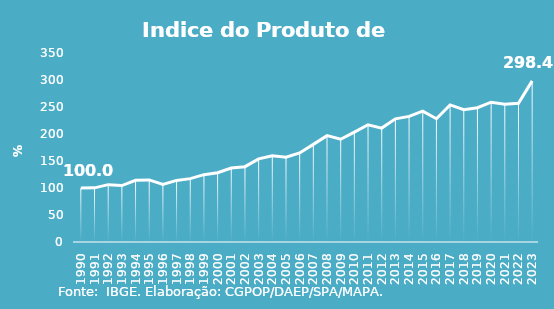
| Category | Indice de Prod. base 1990 |
|---|---|
| 1990.0 | 100 |
| 1991.0 | 100.275 |
| 1992.0 | 106.203 |
| 1993.0 | 104.57 |
| 1994.0 | 114.164 |
| 1995.0 | 115.024 |
| 1996.0 | 106.552 |
| 1997.0 | 114.037 |
| 1998.0 | 117.319 |
| 1999.0 | 124.734 |
| 2000.0 | 128.293 |
| 2001.0 | 136.975 |
| 2002.0 | 139.51 |
| 2003.0 | 153.868 |
| 2004.0 | 159.641 |
| 2005.0 | 157.136 |
| 2006.0 | 164.858 |
| 2007.0 | 180.781 |
| 2008.0 | 196.91 |
| 2009.0 | 190.309 |
| 2010.0 | 203.581 |
| 2011.0 | 217.041 |
| 2012.0 | 210.932 |
| 2013.0 | 228.009 |
| 2014.0 | 232.562 |
| 2015.0 | 242.318 |
| 2016.0 | 228.239 |
| 2017.0 | 253.826 |
| 2018.0 | 245.134 |
| 2019.0 | 248.619 |
| 2020.0 | 258.848 |
| 2021.0 | 254.988 |
| 2022.0 | 256.904 |
| 2023.0 | 298.42 |